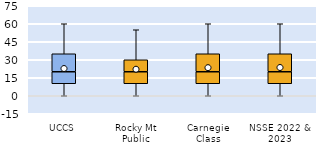
| Category | 25th | 50th | 75th |
|---|---|---|---|
| UCCS | 10 | 10 | 15 |
| Rocky Mt Public | 10 | 10 | 10 |
| Carnegie Class | 10 | 10 | 15 |
| NSSE 2022 & 2023 | 10 | 10 | 15 |